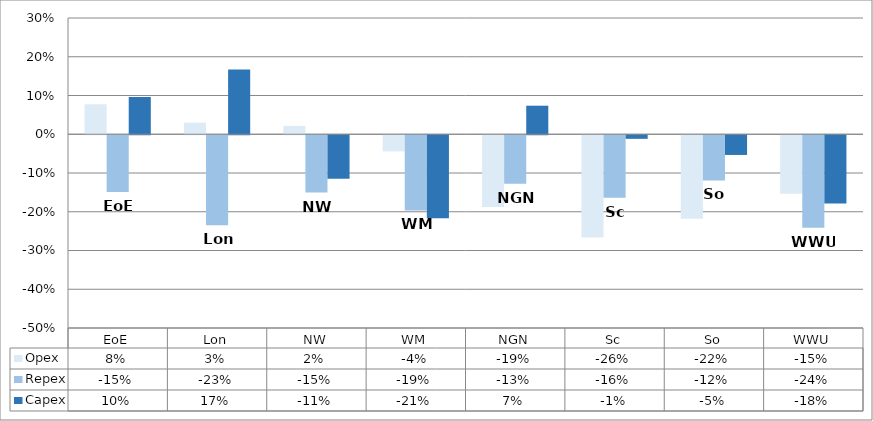
| Category | Opex | Repex | Capex |
|---|---|---|---|
| 0 | 0.077 | -0.147 | 0.096 |
| 1 | 0.03 | -0.232 | 0.167 |
| 2 | 0.022 | -0.148 | -0.112 |
| 3 | -0.042 | -0.194 | -0.214 |
| 4 | -0.185 | -0.125 | 0.074 |
| 5 | -0.264 | -0.161 | -0.009 |
| 6 | -0.216 | -0.117 | -0.051 |
| 7 | -0.151 | -0.239 | -0.176 |